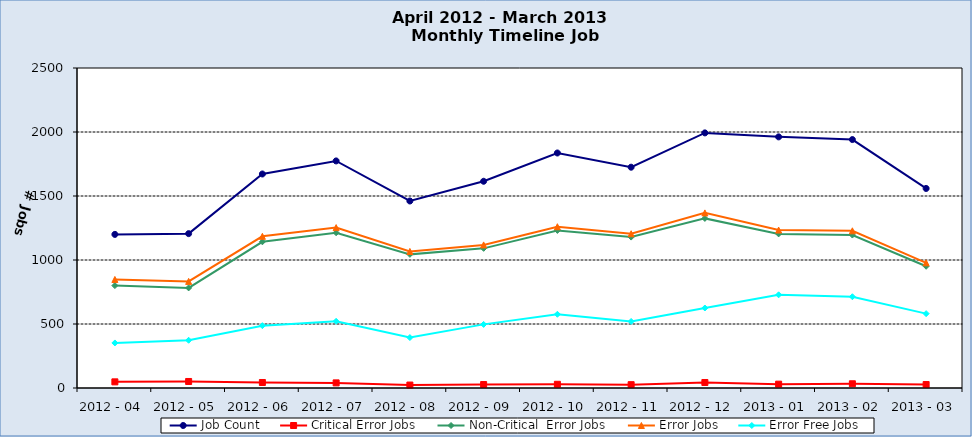
| Category | Job Count | Critical Error Jobs | Non-Critical  Error Jobs | Error Jobs | Error Free Jobs |
|---|---|---|---|---|---|
| 2012 - 04 | 1200 | 48 | 800 | 848 | 352 |
| 2012 - 05 | 1206 | 51 | 782 | 833 | 373 |
| 2012 - 06 | 1672 | 43 | 1142 | 1185 | 487 |
| 2012 - 07 | 1774 | 40 | 1213 | 1253 | 521 |
| 2012 - 08 | 1461 | 23 | 1044 | 1067 | 394 |
| 2012 - 09 | 1615 | 27 | 1091 | 1118 | 497 |
| 2012 - 10 | 1836 | 29 | 1231 | 1260 | 576 |
| 2012 - 11 | 1725 | 26 | 1179 | 1205 | 520 |
| 2012 - 12 | 1993 | 43 | 1325 | 1368 | 625 |
| 2013 - 01 | 1962 | 30 | 1204 | 1234 | 728 |
| 2013 - 02 | 1941 | 33 | 1195 | 1228 | 713 |
| 2013 - 03 | 1559 | 27 | 951 | 978 | 581 |